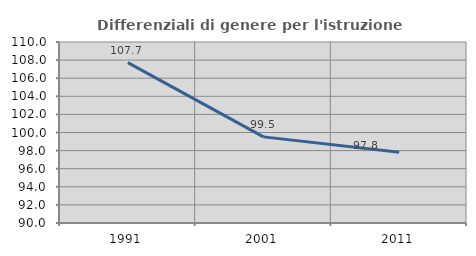
| Category | Differenziali di genere per l'istruzione superiore |
|---|---|
| 1991.0 | 107.722 |
| 2001.0 | 99.516 |
| 2011.0 | 97.824 |